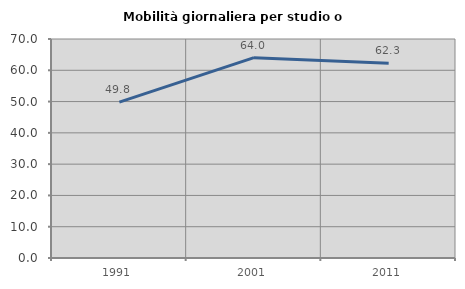
| Category | Mobilità giornaliera per studio o lavoro |
|---|---|
| 1991.0 | 49.818 |
| 2001.0 | 64.046 |
| 2011.0 | 62.28 |